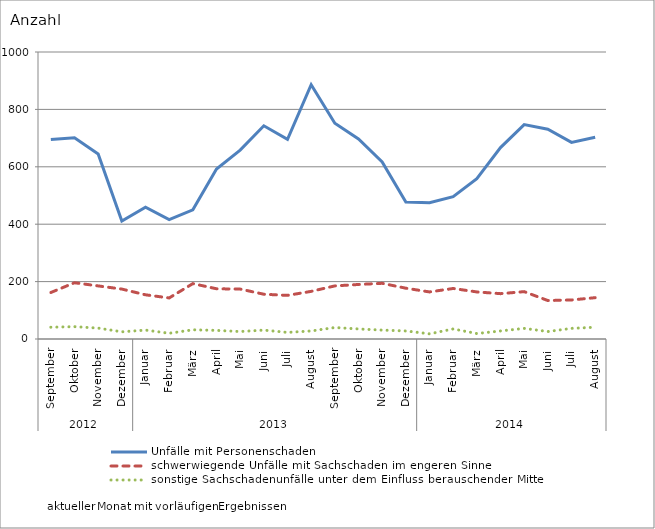
| Category | Unfälle mit Personenschaden | schwerwiegende Unfälle mit Sachschaden im engeren Sinne | sonstige Sachschadenunfälle unter dem Einfluss berauschender Mittel |
|---|---|---|---|
| 0 | 695 | 162 | 41 |
| 1 | 701 | 196 | 43 |
| 2 | 645 | 185 | 38 |
| 3 | 411 | 174 | 25 |
| 4 | 459 | 154 | 31 |
| 5 | 416 | 143 | 20 |
| 6 | 450 | 193 | 32 |
| 7 | 592 | 175 | 30 |
| 8 | 658 | 174 | 26 |
| 9 | 743 | 156 | 31 |
| 10 | 696 | 152 | 23 |
| 11 | 886 | 166 | 28 |
| 12 | 752 | 185 | 40 |
| 13 | 697 | 190 | 35 |
| 14 | 617 | 194 | 31 |
| 15 | 477 | 177 | 28 |
| 16 | 475 | 164 | 18 |
| 17 | 496 | 176 | 35 |
| 18 | 559 | 164 | 19 |
| 19 | 667 | 158 | 28 |
| 20 | 747 | 165 | 37 |
| 21 | 731 | 134 | 26 |
| 22 | 685 | 136 | 37 |
| 23 | 703 | 144 | 41 |